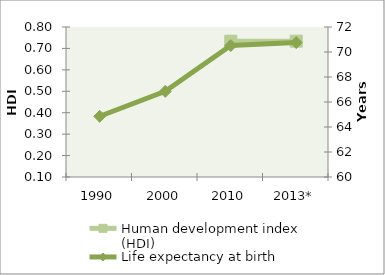
| Category | Human development index (HDI) |
|---|---|
| 1990 | 0 |
| 2000 | 0 |
| 2010 | 0.734 |
| 2013* | 0.734 |